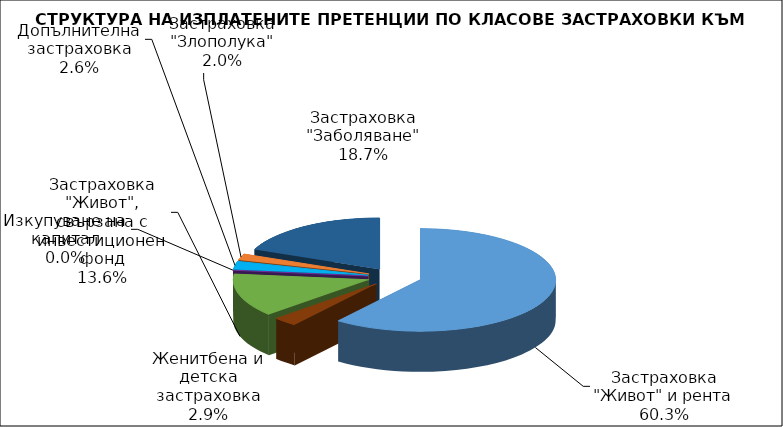
| Category | Застраховка "Живот" и рента |
|---|---|
| Застраховка "Живот" и рента | 141963794.43 |
| Женитбена и детска застраховка | 6850083.817 |
| Застраховка "Живот", свързана с инвестиционен фонд | 31996650.707 |
| Изкупуване на капитал | 0 |
| Допълнителна застраховка | 6025612.141 |
| Застраховка "Злополука" | 4658969.864 |
| Застраховка "Заболяване" | 43984295.607 |